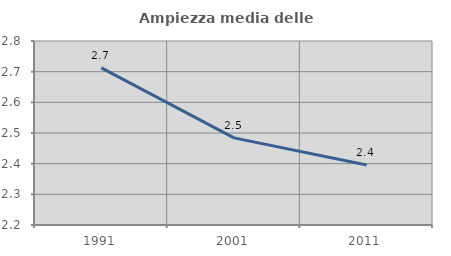
| Category | Ampiezza media delle famiglie |
|---|---|
| 1991.0 | 2.712 |
| 2001.0 | 2.484 |
| 2011.0 | 2.396 |